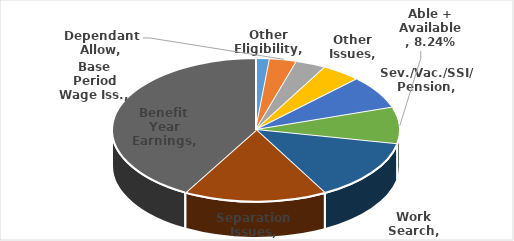
| Category | Series 0 |
|---|---|
| Other Eligibility | 0.016 |
| Dependant Allow | 0.03 |
| Other Issues | 0.034 |
| Base Period Wage Iss. | 0.044 |
| Sev./Vac./SSI/ Pension | 0.075 |
| Able + Available | 0.082 |
| Work Search | 0.139 |
| Separation Issues | 0.161 |
| Benefit Year Earnings | 0.419 |